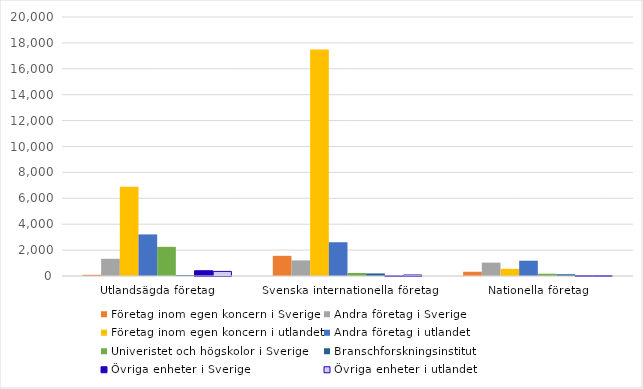
| Category | Företag inom egen koncern i Sverige | Andra företag i Sverige | Företag inom egen koncern i utlandet | Andra företag i utlandet | Univeristet och högskolor i Sverige | Branschforskningsinstitut | Övriga enheter i Sverige | Övriga enheter i utlandet |
|---|---|---|---|---|---|---|---|---|
| Utlandsägda företag | 94.075 | 1328.515 | 6896.483 | 3211.318 | 2252.371 | 73.439 | 406.336 | 355.689 |
| Svenska internationella företag | 1556.736 | 1205.895 | 17484.04 | 2606.139 | 235.418 | 198.15 | 9.003 | 76.956 |
| Nationella företag | 328.618 | 1032.682 | 554.042 | 1179.659 | 174.58 | 135.015 | 30.634 | 36.075 |